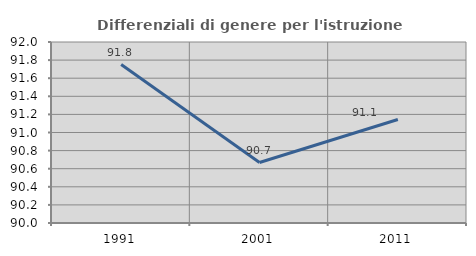
| Category | Differenziali di genere per l'istruzione superiore |
|---|---|
| 1991.0 | 91.75 |
| 2001.0 | 90.668 |
| 2011.0 | 91.143 |